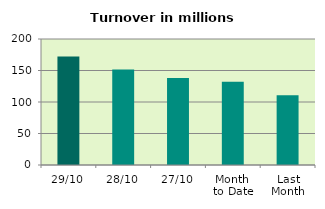
| Category | Series 0 |
|---|---|
| 29/10 | 172.026 |
| 28/10 | 151.727 |
| 27/10 | 137.928 |
| Month 
to Date | 132.268 |
| Last
Month | 110.611 |